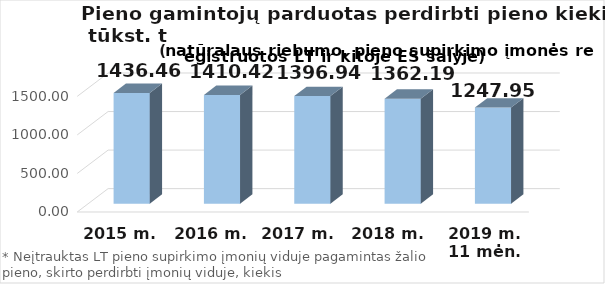
| Category | Viso |
|---|---|
| 2015 m. | 1436.455 |
| 2016 m. | 1410.42 |
| 2017 m.  | 1396.944 |
| 2018 m.  | 1362.189 |
| 2019 m. 11 mėn. | 1247.95 |